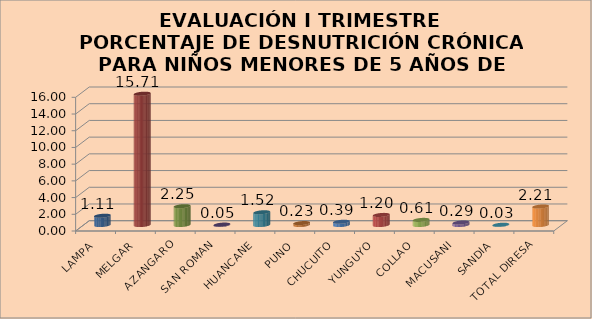
| Category | Series 0 |
|---|---|
| LAMPA | 1.108 |
| MELGAR | 15.714 |
| AZANGARO | 2.25 |
| SAN ROMAN | 0.047 |
| HUANCANE | 1.523 |
| PUNO | 0.229 |
| CHUCUITO | 0.386 |
| YUNGUYO | 1.205 |
| COLLAO | 0.61 |
| MACUSANI | 0.292 |
| SANDIA | 0.03 |
| TOTAL DIRESA | 2.209 |